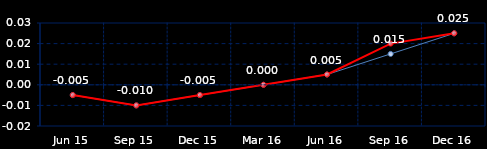
| Category | Series 0 | Series 1 |
|---|---|---|
| Jun 15 | -0.005 | -0.005 |
| Sep 15 | -0.01 | -0.01 |
| Dec 15 | -0.005 | -0.005 |
| Mar 16 | 0 | 0 |
| Jun 16 | 0.005 | 0.005 |
| Sep 16 | 0.015 | 0.02 |
| Dec 16 | 0.025 | 0.025 |